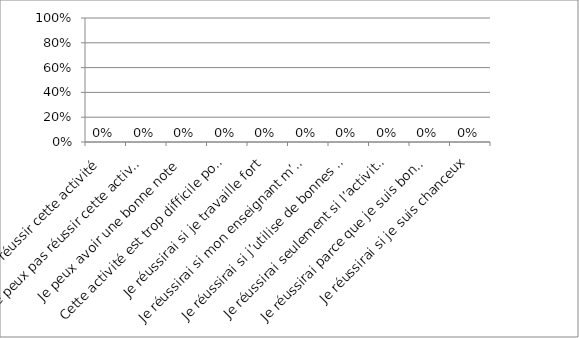
| Category | Series 0 |
|---|---|
| Je peux réussir cette activité | 0 |
| Je ne peux pas réussir cette activité de lecture | 0 |
| Je peux avoir une bonne note | 0 |
| Cette activité est trop difficile pour moi | 0 |
| Je réussirai si je travaille fort | 0 |
| Je réussirai si mon enseignant m’aide | 0 |
| Je réussirai si j’utilise de bonnes façons de travailler | 0 |
| Je réussirai seulement si l’activité est facile | 0 |
| Je réussirai parce que je suis bon en lecture | 0 |
| Je réussirai si je suis chanceux | 0 |